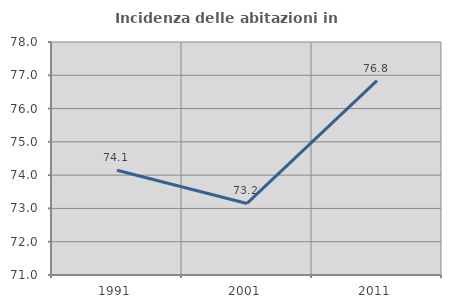
| Category | Incidenza delle abitazioni in proprietà  |
|---|---|
| 1991.0 | 74.146 |
| 2001.0 | 73.15 |
| 2011.0 | 76.842 |